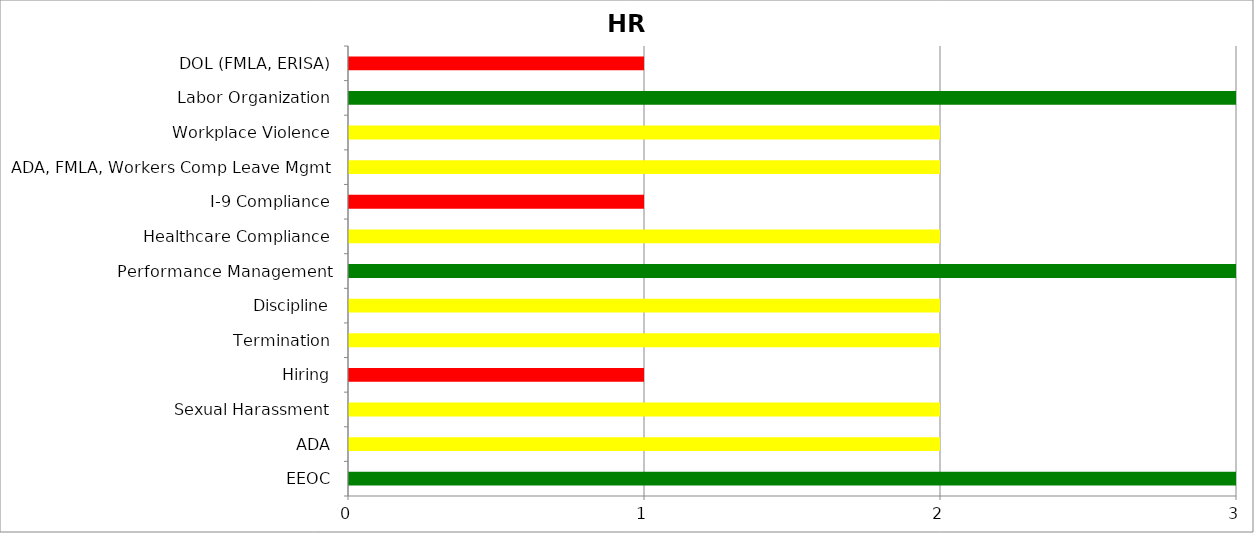
| Category | Low | Medium | High |
|---|---|---|---|
| EEOC | 3 | 0 | 0 |
| ADA | 0 | 2 | 0 |
| Sexual Harassment | 0 | 2 | 0 |
| Hiring | 0 | 0 | 1 |
| Termination | 0 | 2 | 0 |
| Discipline | 0 | 2 | 0 |
| Performance Management | 3 | 0 | 0 |
| Healthcare Compliance | 0 | 2 | 0 |
| I-9 Compliance | 0 | 0 | 1 |
| ADA, FMLA, Workers Comp Leave Mgmt | 0 | 2 | 0 |
| Workplace Violence | 0 | 2 | 0 |
| Labor Organization | 3 | 0 | 0 |
| DOL (FMLA, ERISA) | 0 | 0 | 1 |